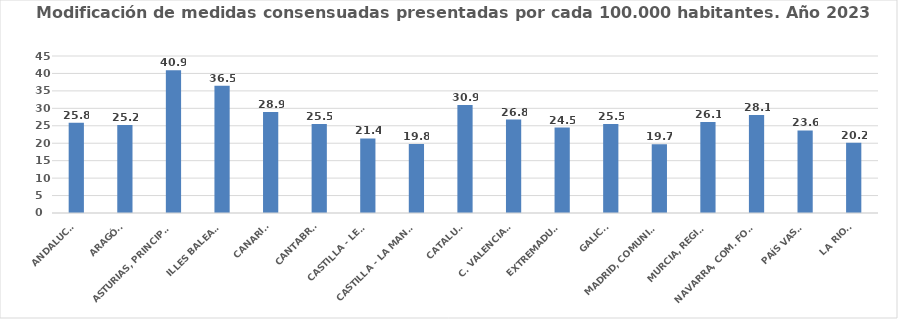
| Category | Series 0 |
|---|---|
| ANDALUCÍA | 25.843 |
| ARAGÓN | 25.198 |
| ASTURIAS, PRINCIPADO | 40.93 |
| ILLES BALEARS | 36.462 |
| CANARIAS | 28.921 |
| CANTABRIA | 25.487 |
| CASTILLA - LEÓN | 21.364 |
| CASTILLA - LA MANCHA | 19.802 |
| CATALUÑA | 30.928 |
| C. VALENCIANA | 26.79 |
| EXTREMADURA | 24.471 |
| GALICIA | 25.521 |
| MADRID, COMUNIDAD | 19.711 |
| MURCIA, REGIÓN | 26.084 |
| NAVARRA, COM. FORAL | 28.117 |
| PAÍS VASCO | 23.65 |
| LA RIOJA | 20.17 |